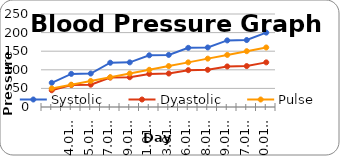
| Category | Systolic | Dyastolic | Pulse |
|---|---|---|---|
| nan | 65 | 45 | 50 |
| 1/4/12 | 89 | 59 | 60 |
| 1/5/12 | 90 | 60 | 70 |
| 1/7/12 | 119 | 79 | 80 |
| 1/9/12 | 120 | 80 | 90 |
| 1/11/12 | 139 | 89 | 100 |
| 1/13/12 | 140 | 90 | 110 |
| 1/16/12 | 159 | 99 | 120 |
| 1/18/12 | 160 | 100 | 130 |
| 1/19/12 | 179 | 109 | 140 |
| 1/27/12 | 180 | 110 | 150 |
| 1/30/12 | 200 | 120 | 160 |